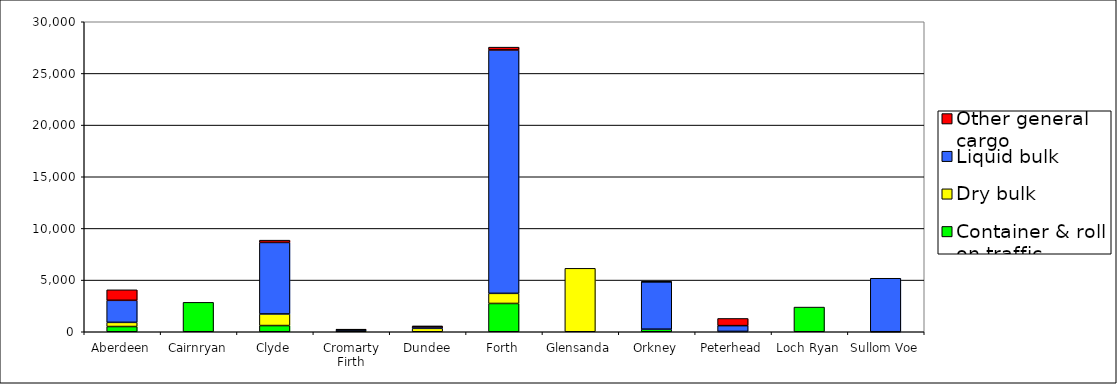
| Category | Container & roll on traffic | Dry bulk | Liquid bulk | Other general cargo |
|---|---|---|---|---|
| Aberdeen | 505 | 405 | 2131 | 1018 |
| Cairnryan | 2847 | 0 | 0 | 0 |
| Clyde | 599 | 1125 | 6918 | 223 |
| Cromarty Firth | 0 | 131 | 71 | 24 |
| Dundee | 0 | 330 | 145 | 92 |
| Forth | 2737 | 979 | 23556 | 272 |
| Glensanda | 0 | 6138 | 0 | 0 |
| Orkney | 242 | 9 | 4585 | 16 |
| Peterhead | 0 | 32 | 560 | 696 |
| Loch Ryan | 2388 | 0 | 0 | 0 |
| Sullom Voe | 0 | 3 | 5175 | 0 |